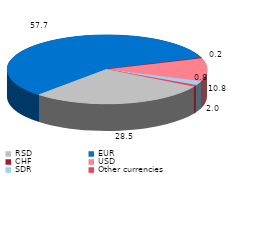
| Category | Series 0 |
|---|---|
| RSD | 28.5 |
| EUR | 57.7 |
| CHF | 0.2 |
| USD | 10.8 |
| SDR | 2 |
| Other currencies | 0.8 |